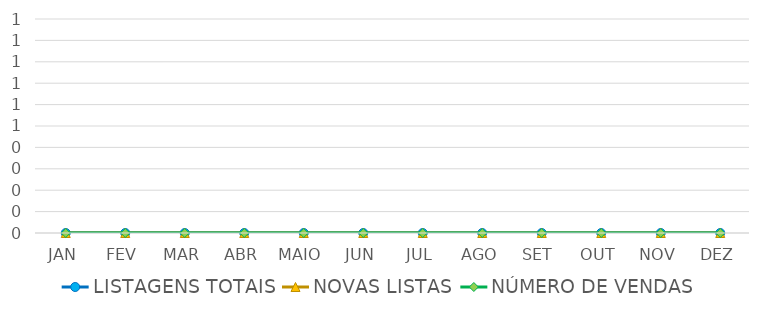
| Category | LISTAGENS TOTAIS | NOVAS LISTAS | NÚMERO DE VENDAS |
|---|---|---|---|
| JAN | 0 | 0 | 0 |
| FEV | 0 | 0 | 0 |
| MAR | 0 | 0 | 0 |
| ABR | 0 | 0 | 0 |
| MAIO | 0 | 0 | 0 |
| JUN | 0 | 0 | 0 |
| JUL | 0 | 0 | 0 |
| AGO | 0 | 0 | 0 |
| SET | 0 | 0 | 0 |
| OUT | 0 | 0 | 0 |
| NOV | 0 | 0 | 0 |
| DEZ | 0 | 0 | 0 |